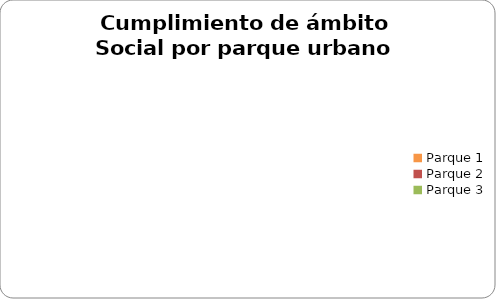
| Category | Social |
|---|---|
| Parque 1 | 0 |
| Parque 2 | 0 |
| Parque 3 | 0 |